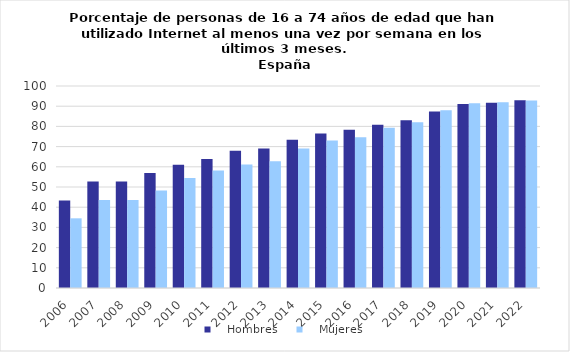
| Category |    Hombres |    Mujeres |
|---|---|---|
| 2006.0 | 43.3 | 34.5 |
| 2007.0 | 52.7 | 43.6 |
| 2008.0 | 52.7 | 43.6 |
| 2009.0 | 56.9 | 48.3 |
| 2010.0 | 61 | 54.4 |
| 2011.0 | 63.8 | 58.2 |
| 2012.0 | 68 | 61.1 |
| 2013.0 | 69.1 | 62.7 |
| 2014.0 | 73.4 | 69 |
| 2015.0 | 76.5 | 73 |
| 2016.0 | 78.3 | 74.6 |
| 2017.0 | 80.8 | 79.3 |
| 2018.0 | 83 | 82 |
| 2019.0 | 87.4 | 88 |
| 2020.0 | 91.1 | 91.4 |
| 2021.0 | 91.7 | 91.9 |
| 2022.0 | 93 | 92.8 |